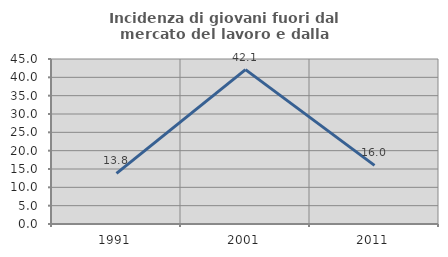
| Category | Incidenza di giovani fuori dal mercato del lavoro e dalla formazione  |
|---|---|
| 1991.0 | 13.793 |
| 2001.0 | 42.105 |
| 2011.0 | 16 |